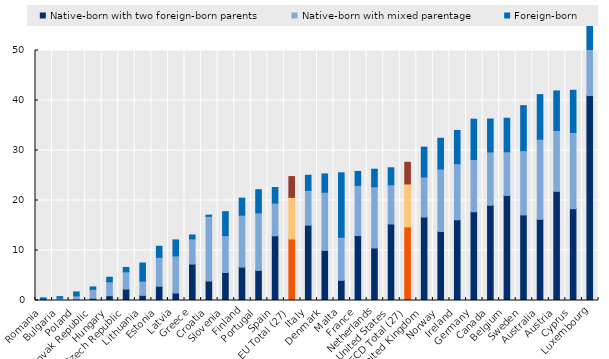
| Category | Native-born with two foreign-born parents | Native-born with mixed parentage | Foreign-born |
|---|---|---|---|
| Romania | 0.02 | 0.163 | 0.343 |
| Bulgaria | 0.149 | 0.34 | 0.278 |
| Poland | 0.135 | 0.791 | 0.782 |
| Slovak Republic | 0.437 | 1.797 | 0.476 |
| Hungary | 0.961 | 2.773 | 0.919 |
| Czech Republic | 2.279 | 3.464 | 0.873 |
| Lithuania | 1.024 | 2.841 | 3.633 |
| Estonia | 2.848 | 5.792 | 2.205 |
| Latvia | 1.49 | 7.44 | 3.191 |
| Greece | 7.286 | 5.046 | 0.774 |
| Croatia | 3.899 | 12.936 | 0.24 |
| Slovenia | 5.597 | 7.37 | 4.806 |
| Finland | 6.681 | 10.387 | 3.415 |
| Portugal | 6.01 | 11.524 | 4.626 |
| Spain | 12.936 | 6.537 | 3.13 |
| EU Total (27) | 12.306 | 8.316 | 4.164 |
| Italy | 15.068 | 6.964 | 3.018 |
| Denmark | 10.017 | 11.631 | 3.663 |
| Malta | 4.04 | 8.617 | 12.877 |
| France | 12.987 | 10.031 | 2.803 |
| Netherlands | 10.509 | 12.241 | 3.514 |
| United States | 15.303 | 7.843 | 3.397 |
| OECD Total (27) | 14.728 | 8.591 | 4.319 |
| United Kingdom | 16.69 | 8.03 | 5.95 |
| Norway | 13.807 | 12.496 | 6.148 |
| Ireland | 16.145 | 11.209 | 6.655 |
| Germany | 17.749 | 10.448 | 8.073 |
| Canada | 19.051 | 10.671 | 6.578 |
| Belgium | 21.011 | 8.741 | 6.695 |
| Sweden | 17.107 | 12.865 | 9 |
| Australia | 16.235 | 16.019 | 8.918 |
| Austria | 21.829 | 12.173 | 7.913 |
| Cyprus | 18.354 | 15.253 | 8.437 |
| Luxembourg | 40.993 | 15.864 | 20.916 |